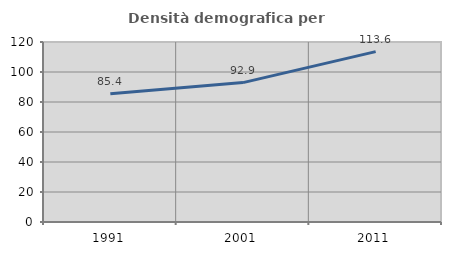
| Category | Densità demografica |
|---|---|
| 1991.0 | 85.44 |
| 2001.0 | 92.94 |
| 2011.0 | 113.563 |